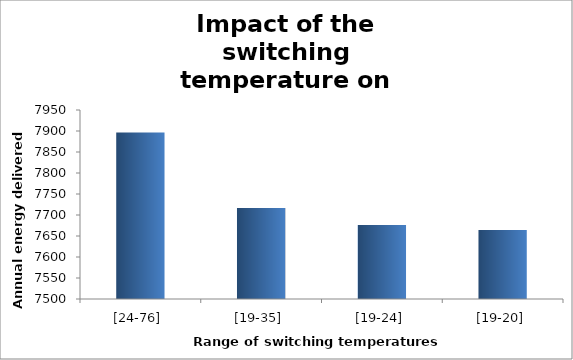
| Category | Series 0 |
|---|---|
| [24-76] | 7896.32 |
| [19-35] | 7716.5 |
| [19-24] | 7676.06 |
| [19-20] | 7664.16 |